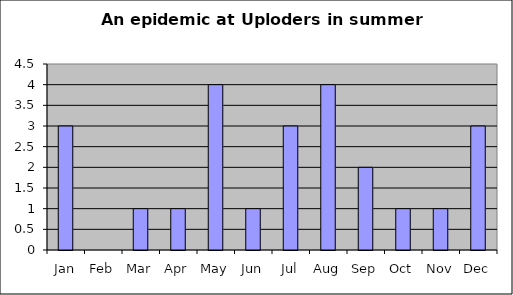
| Category | Series 0 |
|---|---|
| Jan | 3 |
| Feb | 0 |
| Mar | 1 |
| Apr | 1 |
| May | 4 |
| Jun | 1 |
| Jul | 3 |
| Aug | 4 |
| Sep | 2 |
| Oct | 1 |
| Nov | 1 |
| Dec | 3 |